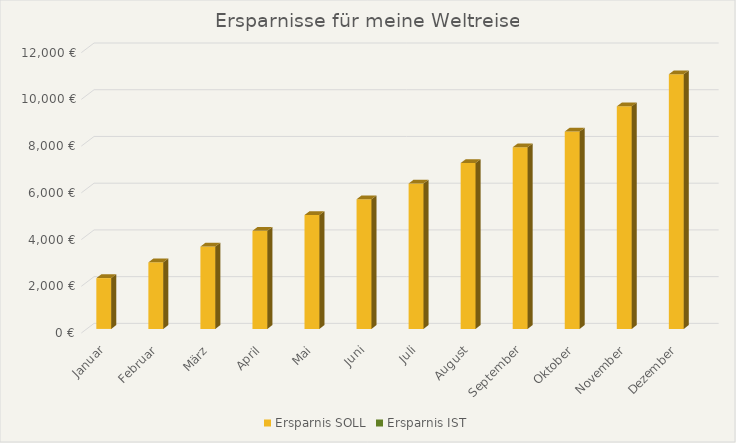
| Category | Ersparnis SOLL | Ersparnis IST |
|---|---|---|
| Januar | 2175 |  |
| Februar | 2850 |  |
| März | 3525 |  |
| April | 4200 |  |
| Mai | 4875 |  |
| Juni | 5550 |  |
| Juli | 6225 |  |
| August | 7100 |  |
| September | 7775 |  |
| Oktober | 8450 |  |
| November | 9525 |  |
| Dezember | 10900 |  |